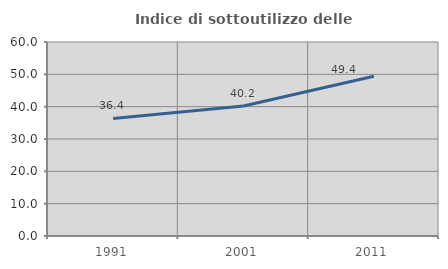
| Category | Indice di sottoutilizzo delle abitazioni  |
|---|---|
| 1991.0 | 36.364 |
| 2001.0 | 40.217 |
| 2011.0 | 49.425 |